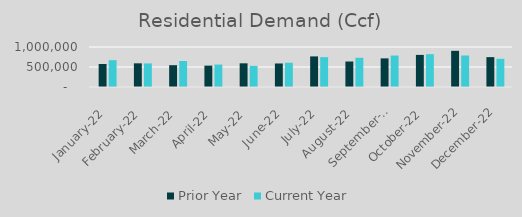
| Category | Prior Year | Current Year |
|---|---|---|
| 2022-01-01 | 574964.407 | 670556.394 |
| 2022-02-01 | 591912.627 | 589693.822 |
| 2022-03-01 | 545392.69 | 650741.307 |
| 2022-04-01 | 533967.423 | 560920.541 |
| 2022-05-01 | 591911.753 | 528033 |
| 2022-06-01 | 587861.265 | 605957.158 |
| 2022-07-01 | 764849.567 | 746133 |
| 2022-08-01 | 637451.79 | 730870.571 |
| 2022-09-01 | 715703.433 | 786683 |
| 2022-10-01 | 802383.882 | 820653 |
| 2022-11-01 | 904247.352 | 787530.042 |
| 2022-12-01 | 746791.488 | 705100.08 |